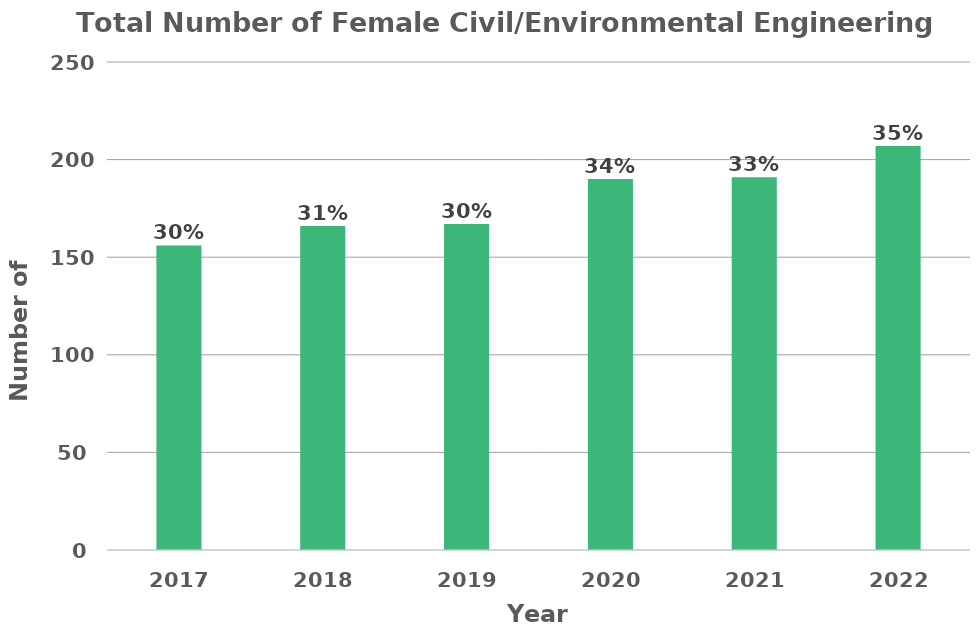
| Category | Total Number of Female Mechanical Engineering Students |
|---|---|
| 2017.0 | 156 |
| 2018.0 | 166 |
| 2019.0 | 167 |
| 2020.0 | 190 |
| 2021.0 | 191 |
| 2022.0 | 207 |